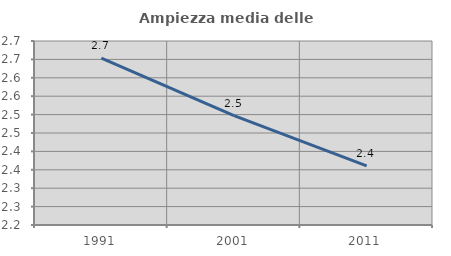
| Category | Ampiezza media delle famiglie |
|---|---|
| 1991.0 | 2.654 |
| 2001.0 | 2.497 |
| 2011.0 | 2.361 |